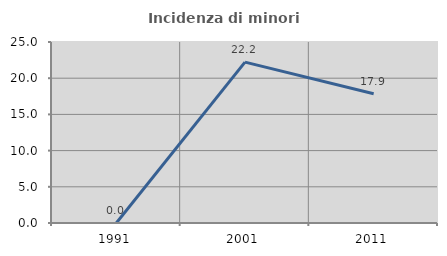
| Category | Incidenza di minori stranieri |
|---|---|
| 1991.0 | 0 |
| 2001.0 | 22.222 |
| 2011.0 | 17.857 |